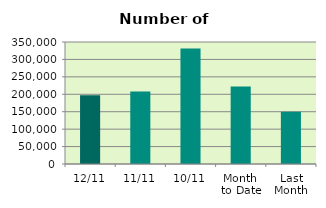
| Category | Series 0 |
|---|---|
| 12/11 | 196876 |
| 11/11 | 207840 |
| 10/11 | 331394 |
| Month 
to Date | 222499.556 |
| Last
Month | 149554.818 |